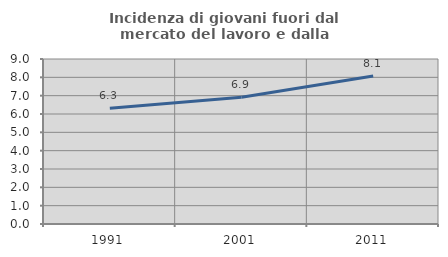
| Category | Incidenza di giovani fuori dal mercato del lavoro e dalla formazione  |
|---|---|
| 1991.0 | 6.317 |
| 2001.0 | 6.912 |
| 2011.0 | 8.077 |